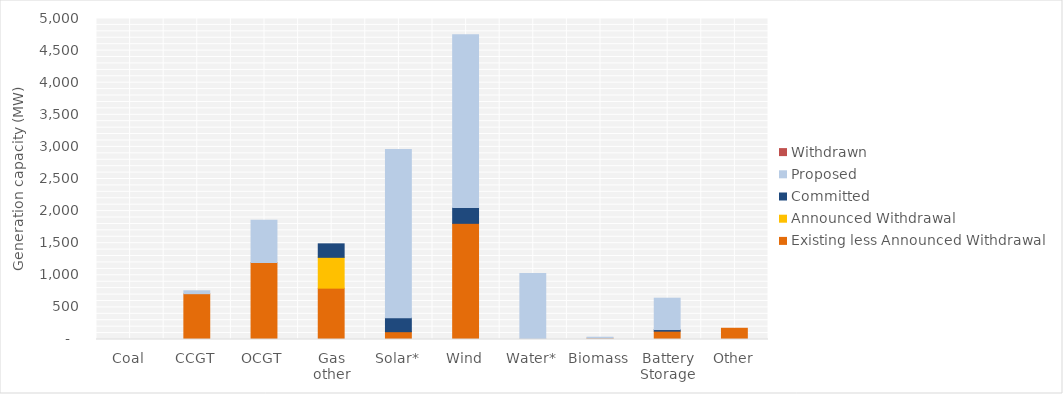
| Category | Existing less Announced Withdrawal | Announced Withdrawal | Committed | Proposed | Withdrawn |
|---|---|---|---|---|---|
| Coal | 0 | 0 | 0 | 0 | 0 |
| CCGT | 713.5 | 0 | 0 | 45 | 0 |
| OCGT | 1198.04 | 0 | 0 | 659 | 0 |
| Gas other | 800 | 480 | 210 | 0 | 0 |
| Solar* | 121.618 | 0 | 218 | 2619.5 | 0 |
| Wind | 1809.45 | 0 | 245.4 | 2693.8 | 0 |
| Water* | 3.85 | 0 | 0 | 1025 | 0 |
| Biomass | 20.473 | 0 | 0 | 15 | 0 |
| Battery Storage | 130 | 0 | 25 | 488 | 0 |
| Other | 174.698 | 0 | 0 | 0 | 0 |